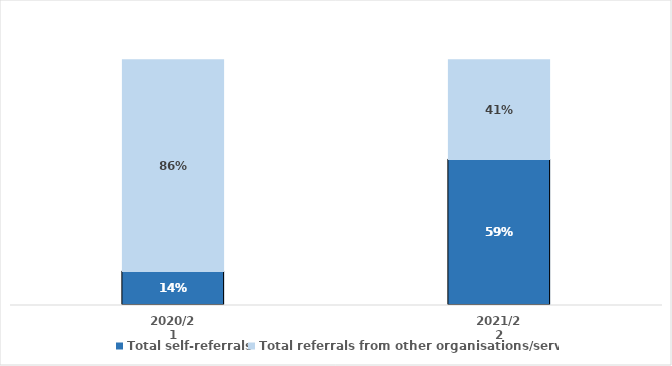
| Category | Total self-referrals | Total referrals from other organisations/services |
|---|---|---|
| 2020/21 | 0.138 | 0.862 |
| 2021/22 | 0.594 | 0.406 |